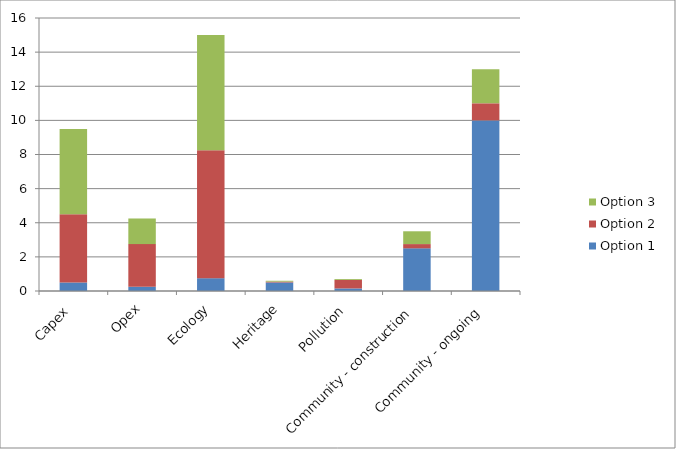
| Category | Option 1 | Option 2 | Option 3 |
|---|---|---|---|
| Capex | 0.5 | 4 | 5 |
| Opex | 0.25 | 2.5 | 1.5 |
| Ecology | 0.75 | 7.5 | 6.75 |
| Heritage | 0.5 | 0.05 | 0.05 |
| Pollution | 0.15 | 0.5 | 0.05 |
| Community - construction | 2.5 | 0.25 | 0.75 |
| Community - ongoing | 10 | 1 | 2 |